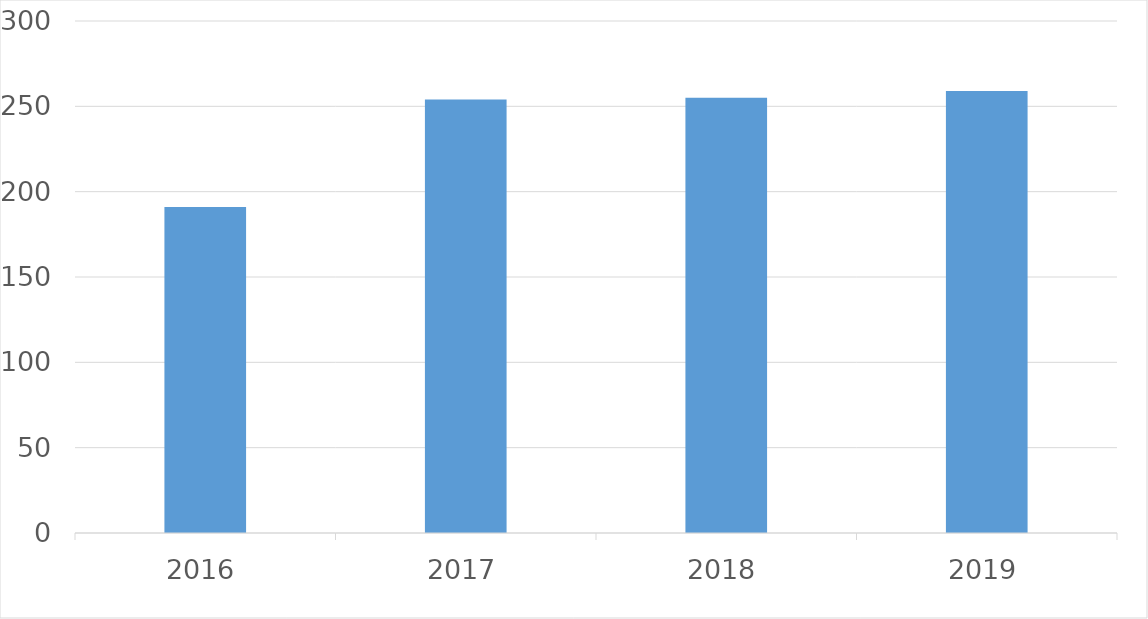
| Category | Series 0 |
|---|---|
| 2016 | 191 |
| 2017 | 254 |
| 2018 | 255 |
| 2019 | 259 |